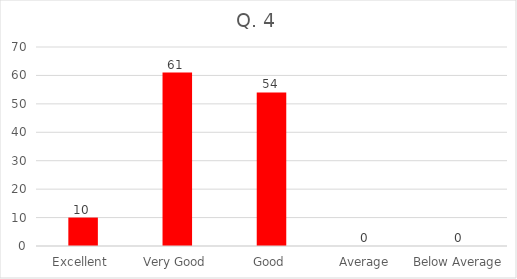
| Category | Series 0 |
|---|---|
| Excellent  | 10 |
| Very Good | 61 |
| Good | 54 |
| Average | 0 |
| Below Average | 0 |